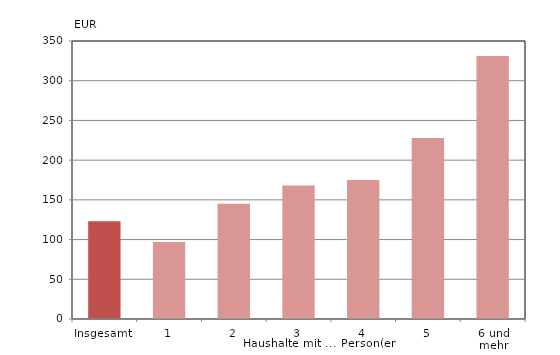
| Category | Series 0 |
|---|---|
| Insgesamt | 123 |
| 1 | 97 |
| 2 | 145 |
| 3 | 168 |
| 4 | 175 |
| 5 | 228 |
| 6 und mehr | 331 |